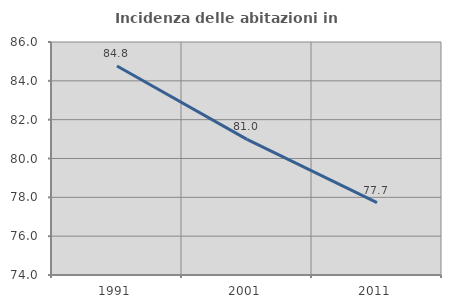
| Category | Incidenza delle abitazioni in proprietà  |
|---|---|
| 1991.0 | 84.765 |
| 2001.0 | 80.987 |
| 2011.0 | 77.727 |